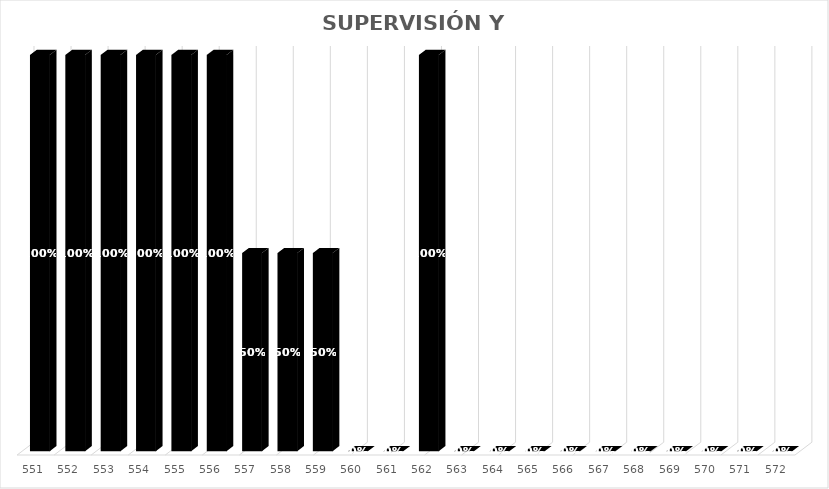
| Category | % Avance |
|---|---|
| 551.0 | 1 |
| 552.0 | 1 |
| 553.0 | 1 |
| 554.0 | 1 |
| 555.0 | 1 |
| 556.0 | 1 |
| 557.0 | 0.5 |
| 558.0 | 0.5 |
| 559.0 | 0.5 |
| 560.0 | 0 |
| 561.0 | 0 |
| 562.0 | 1 |
| 563.0 | 0 |
| 564.0 | 0 |
| 565.0 | 0 |
| 566.0 | 0 |
| 567.0 | 0 |
| 568.0 | 0 |
| 569.0 | 0 |
| 570.0 | 0 |
| 571.0 | 0 |
| 572.0 | 0 |